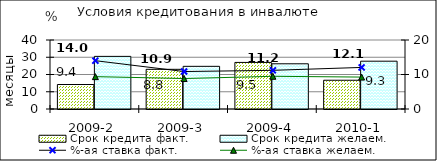
| Category | Срок кредита факт.  | Срок кредита желаем. |
|---|---|---|
| 2009-2 | 14.2 | 30.5 |
| 2009-3 | 23 | 24.73 |
| 2009-4 | 27 | 26.21 |
| 2010-1 | 16.67 | 27.71 |